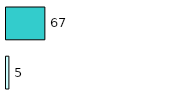
| Category | Series 0 | Series 1 |
|---|---|---|
| 0 | 5 | 67 |